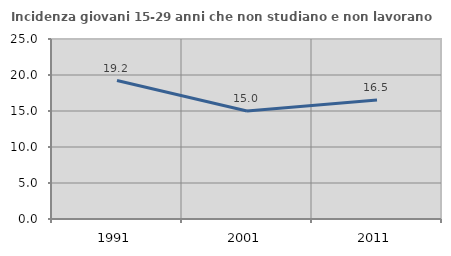
| Category | Incidenza giovani 15-29 anni che non studiano e non lavorano  |
|---|---|
| 1991.0 | 19.231 |
| 2001.0 | 14.991 |
| 2011.0 | 16.527 |